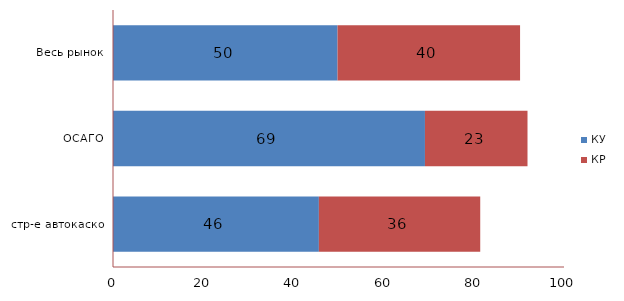
| Category | КУ | КР |
|---|---|---|
| стр-е автокаско | 45.65 | 35.776 |
| ОСАГО | 69.169 | 22.739 |
| Весь рынок | 49.791 | 40.469 |